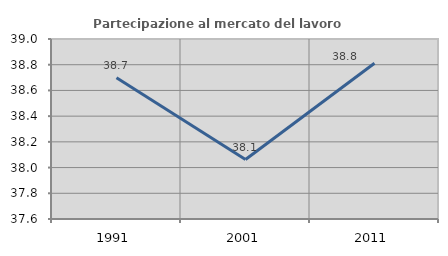
| Category | Partecipazione al mercato del lavoro  femminile |
|---|---|
| 1991.0 | 38.699 |
| 2001.0 | 38.062 |
| 2011.0 | 38.811 |